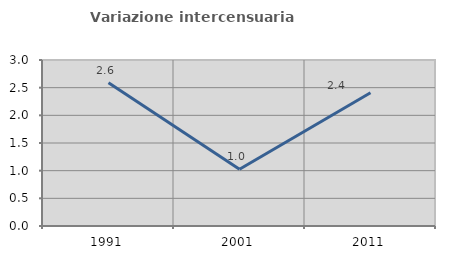
| Category | Variazione intercensuaria annua |
|---|---|
| 1991.0 | 2.588 |
| 2001.0 | 1.025 |
| 2011.0 | 2.41 |